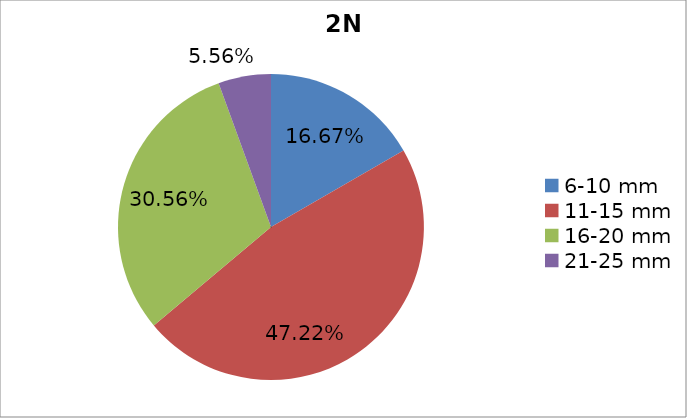
| Category | Series 0 |
|---|---|
| 6-10 mm | 0.167 |
| 11-15 mm | 0.472 |
| 16-20 mm | 0.306 |
| 21-25 mm | 0.056 |